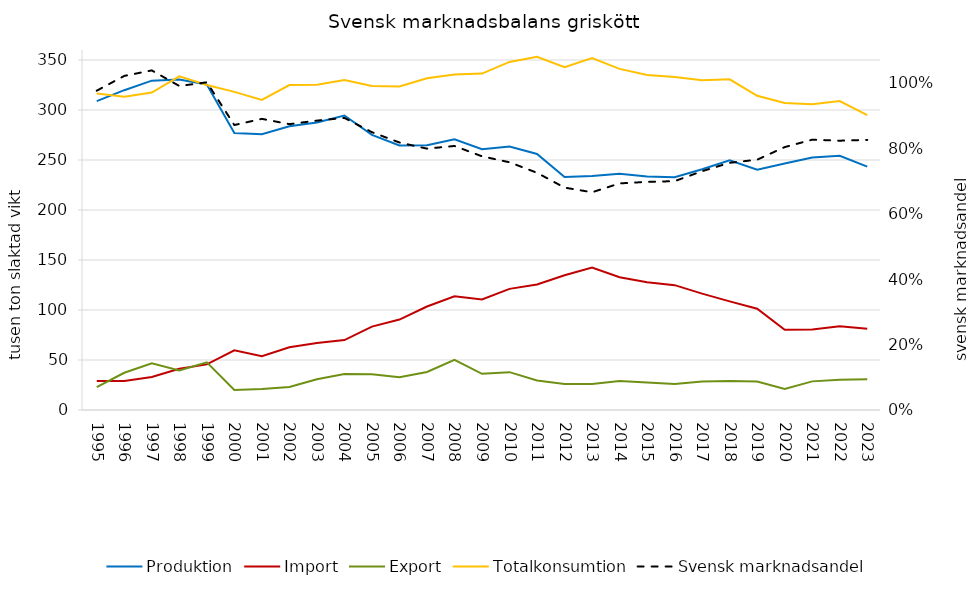
| Category | Produktion | Import | Export | Totalkonsumtion |
|---|---|---|---|---|
| 1995.0 | 308.814 | 29.018 | 22.864 | 316.512 |
| 1996.0 | 319.809 | 29.073 | 37.204 | 313.277 |
| 1997.0 | 329.345 | 33.02 | 46.624 | 317.387 |
| 1998.0 | 330.412 | 41.19 | 39.526 | 333.728 |
| 1999.0 | 325.426 | 45.592 | 47.638 | 325.008 |
| 2000.0 | 276.975 | 59.735 | 19.986 | 318.109 |
| 2001.0 | 275.866 | 53.776 | 20.926 | 310.096 |
| 2002.0 | 283.814 | 62.722 | 23.01 | 324.945 |
| 2003.0 | 287.526 | 66.955 | 30.763 | 325.156 |
| 2004.0 | 294.498 | 69.956 | 35.948 | 329.979 |
| 2005.0 | 275.131 | 83.401 | 35.785 | 324.122 |
| 2006.0 | 264.448 | 90.445 | 32.66 | 323.556 |
| 2007.0 | 264.869 | 103.518 | 38.046 | 331.666 |
| 2008.0 | 270.717 | 113.713 | 50.218 | 335.565 |
| 2009.0 | 260.748 | 110.575 | 36.227 | 336.399 |
| 2010.0 | 263.48 | 121.14 | 37.839 | 348.099 |
| 2011.0 | 256.08 | 125.502 | 29.558 | 353.305 |
| 2012.0 | 232.97 | 134.783 | 26.072 | 342.847 |
| 2013.0 | 234.1 | 142.542 | 25.919 | 351.893 |
| 2014.0 | 236.2 | 132.791 | 29.034 | 341.138 |
| 2015.0 | 233.5 | 127.685 | 27.381 | 334.971 |
| 2016.0 | 232.8 | 124.862 | 25.889 | 332.937 |
| 2017.0 | 240.7 | 116.342 | 28.405 | 329.84 |
| 2018.0 | 249.79 | 108.622 | 28.953 | 330.707 |
| 2019.0 | 240.29 | 101.232 | 28.524 | 314.199 |
| 2020.0 | 246.54 | 80.264 | 21.114 | 306.923 |
| 2021.0 | 252.55 | 80.564 | 28.628 | 305.749 |
| 2022.0 | 254.25 | 83.645 | 30.199 | 308.968 |
| 2023.0 | 243.44 | 81.18 | 30.875 | 294.962 |